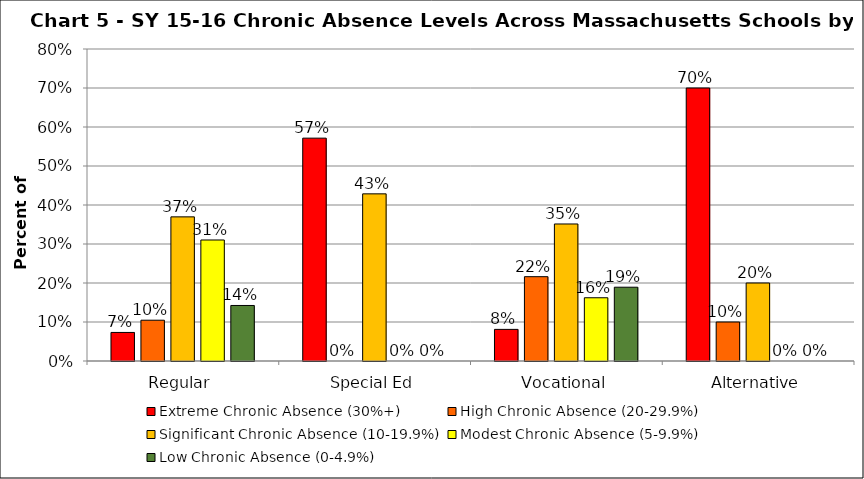
| Category | Extreme Chronic Absence (30%+) | High Chronic Absence (20-29.9%) | Significant Chronic Absence (10-19.9%) | Modest Chronic Absence (5-9.9%) | Low Chronic Absence (0-4.9%) |
|---|---|---|---|---|---|
| 0 | 0.073 | 0.105 | 0.37 | 0.31 | 0.142 |
| 1 | 0.571 | 0 | 0.429 | 0 | 0 |
| 2 | 0.081 | 0.216 | 0.351 | 0.162 | 0.189 |
| 3 | 0.7 | 0.1 | 0.2 | 0 | 0 |